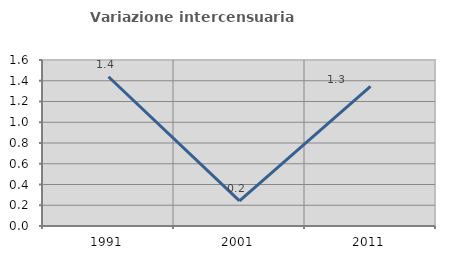
| Category | Variazione intercensuaria annua |
|---|---|
| 1991.0 | 1.438 |
| 2001.0 | 0.242 |
| 2011.0 | 1.345 |